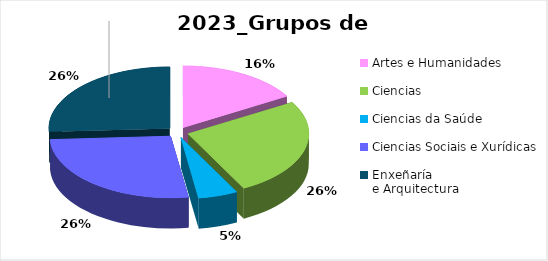
| Category | Series 0 |
|---|---|
| Artes e Humanidades | 28 |
| Ciencias | 44 |
| Ciencias da Saúde | 9 |
| Ciencias Sociais e Xurídicas | 45 |
| Enxeñaría 
e Arquitectura | 44 |